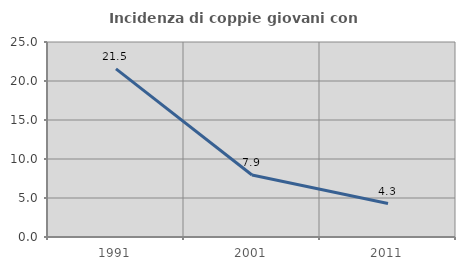
| Category | Incidenza di coppie giovani con figli |
|---|---|
| 1991.0 | 21.547 |
| 2001.0 | 7.947 |
| 2011.0 | 4.286 |